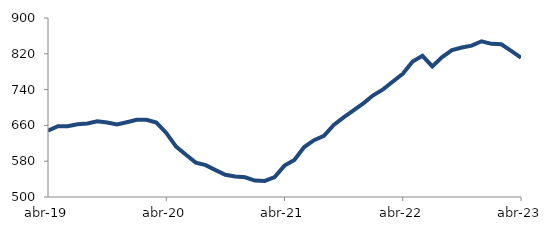
| Category | Series 0 |
|---|---|
| 2019-04-01 | 648.206 |
| 2019-05-01 | 658.035 |
| 2019-06-01 | 657.952 |
| 2019-07-01 | 662.49 |
| 2019-08-01 | 664.104 |
| 2019-09-01 | 669.196 |
| 2019-10-01 | 666.5 |
| 2019-11-01 | 662.174 |
| 2019-12-01 | 667.143 |
| 2020-01-01 | 672.455 |
| 2020-02-01 | 672.659 |
| 2020-03-01 | 666.213 |
| 2020-04-01 | 643.145 |
| 2020-05-01 | 612.572 |
| 2020-06-01 | 594.292 |
| 2020-07-01 | 576.858 |
| 2020-08-01 | 571.224 |
| 2020-09-01 | 560.032 |
| 2020-10-01 | 549.541 |
| 2020-11-01 | 545.982 |
| 2020-12-01 | 544.038 |
| 2021-01-01 | 536.772 |
| 2021-02-01 | 535.938 |
| 2021-03-01 | 544.717 |
| 2021-04-01 | 570.16 |
| 2021-05-01 | 582.981 |
| 2021-06-01 | 611.684 |
| 2021-07-01 | 627.037 |
| 2021-08-01 | 636.642 |
| 2021-09-01 | 661.114 |
| 2021-10-01 | 677.889 |
| 2021-11-01 | 693.389 |
| 2021-12-01 | 709.343 |
| 2022-01-01 | 727.31 |
| 2022-02-01 | 740.539 |
| 2022-03-01 | 758.027 |
| 2022-04-01 | 775.241 |
| 2022-05-01 | 802.956 |
| 2022-06-01 | 815.434 |
| 2022-07-01 | 791.89 |
| 2022-08-01 | 812.76 |
| 2022-09-01 | 828.12 |
| 2022-10-01 | 834 |
| 2022-11-01 | 838.178 |
| 2022-12-01 | 847.954 |
| 2023-01-01 | 842.285 |
| 2023-02-01 | 841.25 |
| 2023-03-01 | 826.38 |
| 2023-04-01 | 811.394 |